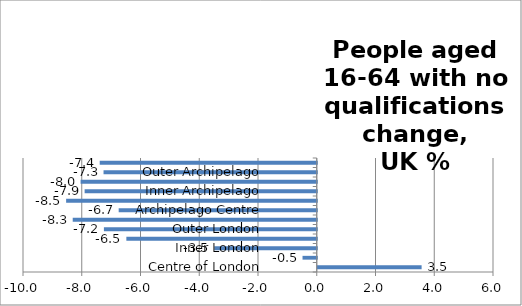
| Category | Series 0 |
|---|---|
| Centre of London | 3.536 |
| London Core | -0.484 |
| Inner London | -3.486 |
| London Suburbs | -6.481 |
| Outer London | -7.246 |
| London Edge | -8.307 |
| Archipelago Centre | -6.743 |
| Archipelago Core | -8.532 |
| Inner Archipelago | -7.902 |
| Archipelago Suburbs | -8.039 |
| Outer Archipelago | -7.258 |
| Archipelago Edge | -7.388 |